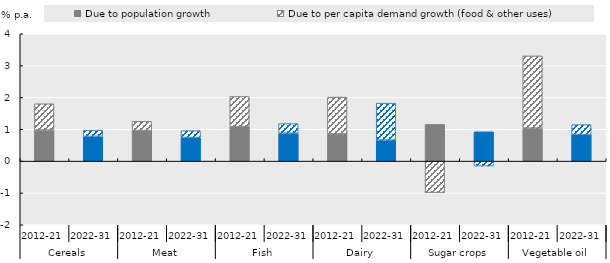
| Category | Due to population growth | Due to per capita demand growth (food & other uses) |
|---|---|---|
| 0 | 0.976 | 0.825 |
| 1 | 0.778 | 0.194 |
| 2 | 0.96 | 0.289 |
| 3 | 0.741 | 0.215 |
| 4 | 1.083 | 0.948 |
| 5 | 0.878 | 0.301 |
| 6 | 0.854 | 1.157 |
| 7 | 0.66 | 1.159 |
| 8 | 1.153 | -0.99 |
| 9 | 0.92 | -0.156 |
| 10 | 1.038 | 2.266 |
| 11 | 0.834 | 0.314 |